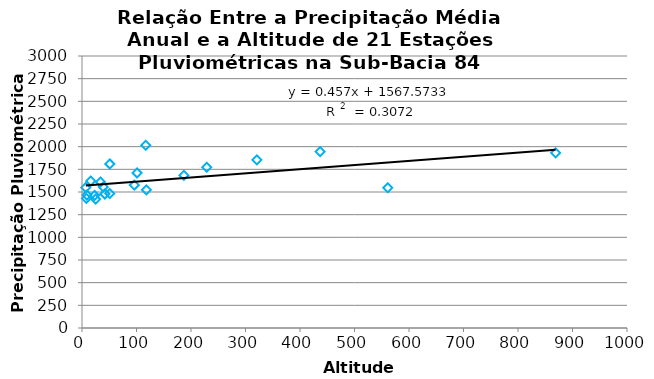
| Category | Series 0 |
|---|---|
| 23.0 | 1462.052 |
| 118.0 | 1523.65 |
| 51.0 | 1483.7 |
| 9.0 | 1466.752 |
| 96.0 | 1576.133 |
| 229.0 | 1772.67 |
| 117.0 | 2014.838 |
| 8.0 | 1430.45 |
| 561.0 | 1546.183 |
| 42.0 | 1478.085 |
| 34.0 | 1609.994 |
| 25.0 | 1420.577 |
| 39.0 | 1555.135 |
| 7.0 | 1549.65 |
| 51.0 | 1809.742 |
| 437.0 | 1945.232 |
| 869.0 | 1930.963 |
| 16.0 | 1621.457 |
| 101.0 | 1710.497 |
| 321.0 | 1854.413 |
| 187.0 | 1683.741 |